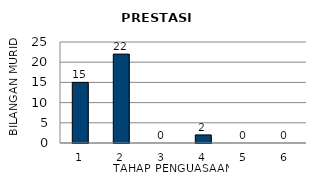
| Category | Series 0 |
|---|---|
| 1.0 | 15 |
| 2.0 | 22 |
| 3.0 | 0 |
| 4.0 | 2 |
| 5.0 | 0 |
| 6.0 | 0 |